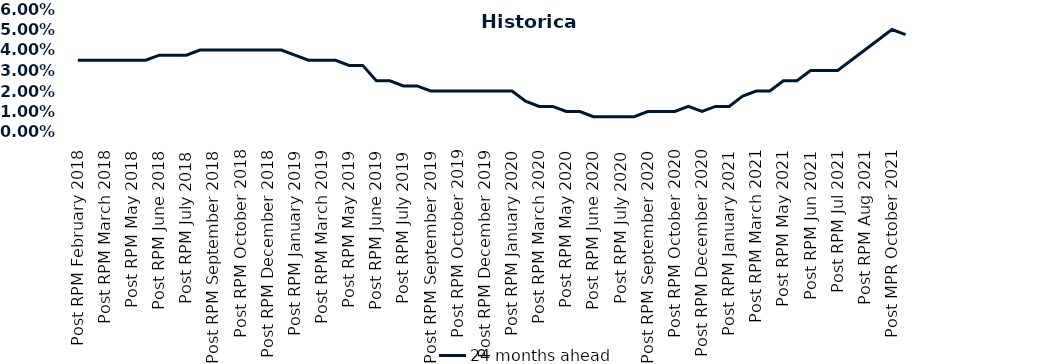
| Category | 24 months ahead |
|---|---|
| Post RPM February 2018 | 0.035 |
| Pre RPM March 2018 | 0.035 |
| Post RPM March 2018 | 0.035 |
| Pre RPM May 2018 | 0.035 |
| Post RPM May 2018 | 0.035 |
| Pre RPM June 2018 | 0.035 |
| Post RPM June 2018 | 0.038 |
| Pre RPM July 2018 | 0.038 |
| Post RPM July 2018 | 0.038 |
| Pre RPM September 2018 | 0.04 |
| Post RPM September 2018 | 0.04 |
| Pre RPM October 2018 | 0.04 |
| Post RPM October 2018 | 0.04 |
| Pre RPM December 2018 | 0.04 |
| Post RPM December 2018 | 0.04 |
| Pre RPM January 2019 | 0.04 |
| Post RPM January 2019 | 0.038 |
| Pre RPM March 2019 | 0.035 |
| Post RPM March 2019 | 0.035 |
| Pre RPM May 2019 | 0.035 |
| Post RPM May 2019 | 0.032 |
| Pre RPM June 2019 | 0.032 |
| Post RPM June 2019 | 0.025 |
| Pre RPM July 2019 | 0.025 |
| Post RPM July 2019 | 0.022 |
| Pre RPM September 2019 | 0.022 |
| Post RPM September 2019 | 0.02 |
| Pre RPM October 2019 | 0.02 |
| Post RPM October 2019 | 0.02 |
| Pre RPM December 2019 | 0.02 |
| Post RPM December 2019 | 0.02 |
| Pre RPM January 2020 | 0.02 |
| Post RPM January 2020 | 0.02 |
| Pre RPM March 2020 | 0.015 |
| Post RPM March 2020 | 0.012 |
| Pre RPM May 2020 | 0.012 |
| Post RPM May 2020 | 0.01 |
| Pre RPM June 2020 | 0.01 |
| Post RPM June 2020 | 0.008 |
| Pre RPM July 2020 | 0.008 |
| Post RPM July 2020 | 0.008 |
| Pre RPM September 2020 | 0.008 |
| Post RPM September 2020 | 0.01 |
| Pre RPM October 2020 | 0.01 |
| Post RPM October 2020 | 0.01 |
| Pre RPM December 2020 | 0.012 |
|  Post RPM December 2020 | 0.01 |
| Pre RPM January 2021 | 0.012 |
| Post RPM January 2021 | 0.012 |
|  Pre RPM March 2021 | 0.018 |
|  Post RPM March 2021 | 0.02 |
|  Pre RPM May 2021 | 0.02 |
|  Post RPM May 2021 | 0.025 |
|  Pre RPM Jun 2021 | 0.025 |
|   Post RPM Jun 2021 | 0.03 |
| Pre RPM Jul 2021 | 0.03 |
|  Post RPM Jul 2021 | 0.03 |
| Pre RPM Aug 2021 | 0.035 |
|  Post RPM Aug 2021 | 0.04 |
| Pre MPR October 2021 | 0.045 |
| Post MPR October 2021 | 0.05 |
| Pre MPR December 2021 | 0.048 |